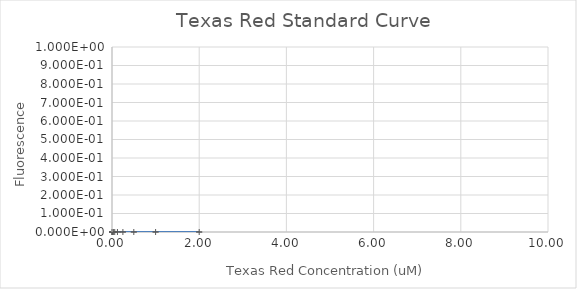
| Category | Series 0 |
|---|---|
| 2.0 | 0 |
| 1.0 | 0 |
| 0.5 | 0 |
| 0.25 | 0 |
| 0.125 | 0 |
| 0.0625 | 0 |
| 0.03125 | 0 |
| 0.015625 | 0 |
| 0.0078125 | 0 |
| 0.00390625 | 0 |
| 0.001953125 | 0 |
| 0.0 | 0 |